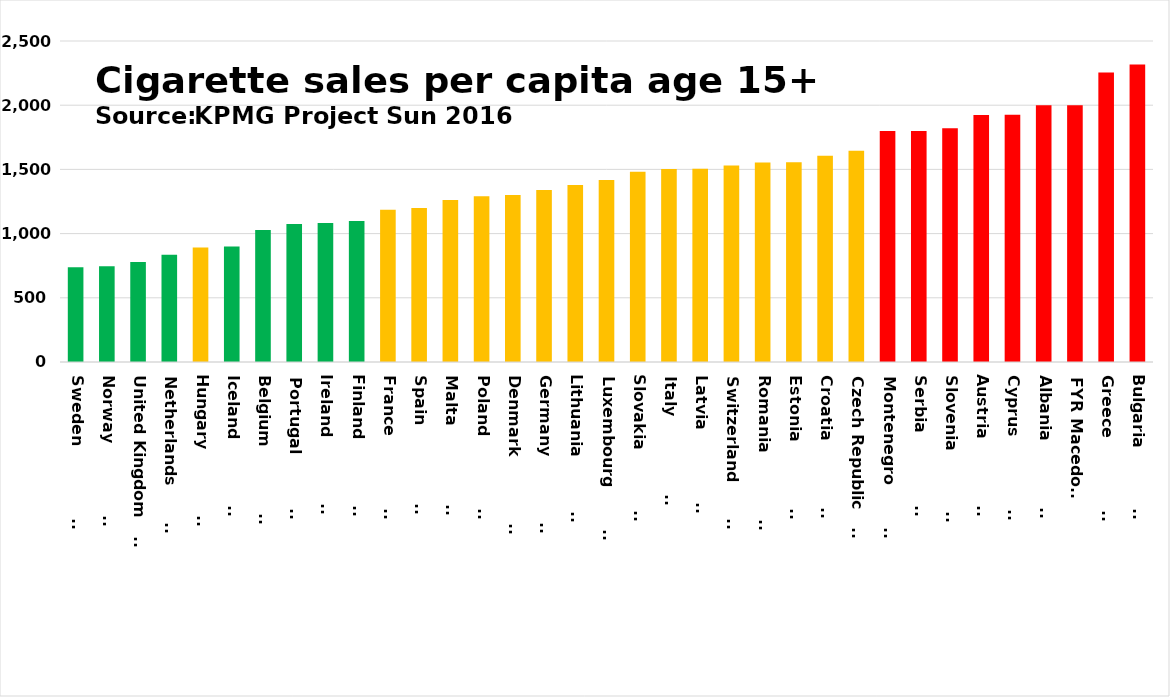
| Category | Series 0 |
|---|---|
| Sweden                 | 737.714 |
| Norway                 | 746.117 |
| United Kingdom         | 779.719 |
| Netherlands            | 835.006 |
| Hungary                | 891.129 |
| Iceland                | 900 |
| Belgium                | 1028.752 |
| Portugal               | 1075.441 |
| Ireland                | 1082.944 |
| Finland                | 1098.664 |
| France                 | 1186.691 |
| Spain                  | 1198.585 |
| Malta                  | 1262.479 |
| Poland                 | 1290.587 |
| Denmark                | 1300.396 |
| Germany                | 1340.221 |
| Lithuania              | 1378.288 |
| Luxembourg             | 1416.621 |
| Slovakia               | 1481.712 |
| Italy                  | 1503.049 |
| Latvia                 | 1505.724 |
| Switzerland            | 1530.049 |
| Romania                | 1554.155 |
| Estonia                | 1556.008 |
| Croatia                | 1605.756 |
| Czech Republic         | 1644.755 |
| Montenegro             | 1800 |
| Serbia                 | 1800 |
| Slovenia               | 1819.538 |
| Austria                | 1923.205 |
| Cyprus                 | 1924.718 |
| Albania                | 2000 |
| FYR Macedonia | 2000 |
| Greece                 | 2254.98 |
| Bulgaria               | 2316.781 |